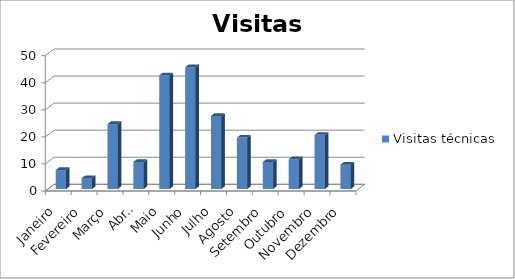
| Category | Visitas técnicas |
|---|---|
| Janeiro | 7 |
| Fevereiro | 4 |
| Março | 24 |
| Abril | 10 |
| Maio | 42 |
| Junho | 45 |
| Julho | 27 |
| Agosto | 19 |
| Setembro | 10 |
| Outubro | 11 |
| Novembro | 20 |
| Dezembro | 9 |